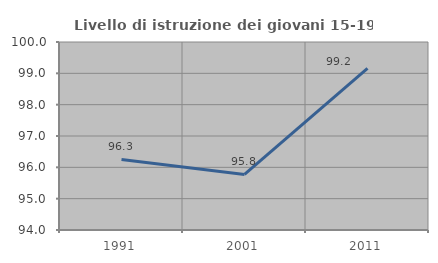
| Category | Livello di istruzione dei giovani 15-19 anni |
|---|---|
| 1991.0 | 96.252 |
| 2001.0 | 95.775 |
| 2011.0 | 99.161 |